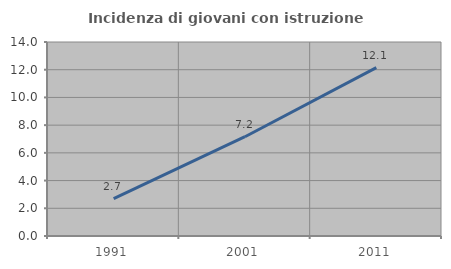
| Category | Incidenza di giovani con istruzione universitaria |
|---|---|
| 1991.0 | 2.692 |
| 2001.0 | 7.164 |
| 2011.0 | 12.15 |